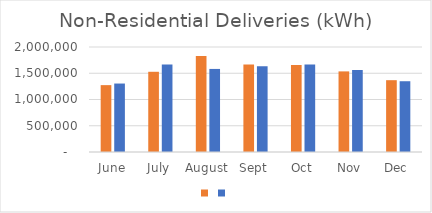
| Category | Series 1 | Series 0 |
|---|---|---|
| June | 1273660 | 1304116 |
| July | 1527956 | 1664865 |
| August | 1829758 | 1582276 |
| Sept | 1665239 | 1633351 |
| Oct | 1657467 | 1665276 |
| Nov | 1535448 | 1561812 |
| Dec | 1367905 | 1348000 |